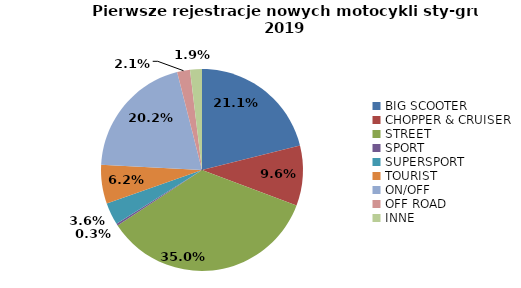
| Category | Series 0 |
|---|---|
| 0 | 4031 |
| 1 | 1840 |
| 2 | 6691 |
| 3 | 57 |
| 4 | 681 |
| 5 | 1186 |
| 6 | 3860 |
| 7 | 394 |
| 8 | 363 |